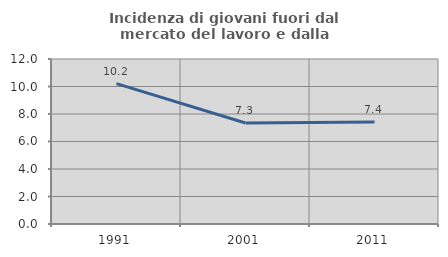
| Category | Incidenza di giovani fuori dal mercato del lavoro e dalla formazione  |
|---|---|
| 1991.0 | 10.213 |
| 2001.0 | 7.345 |
| 2011.0 | 7.416 |